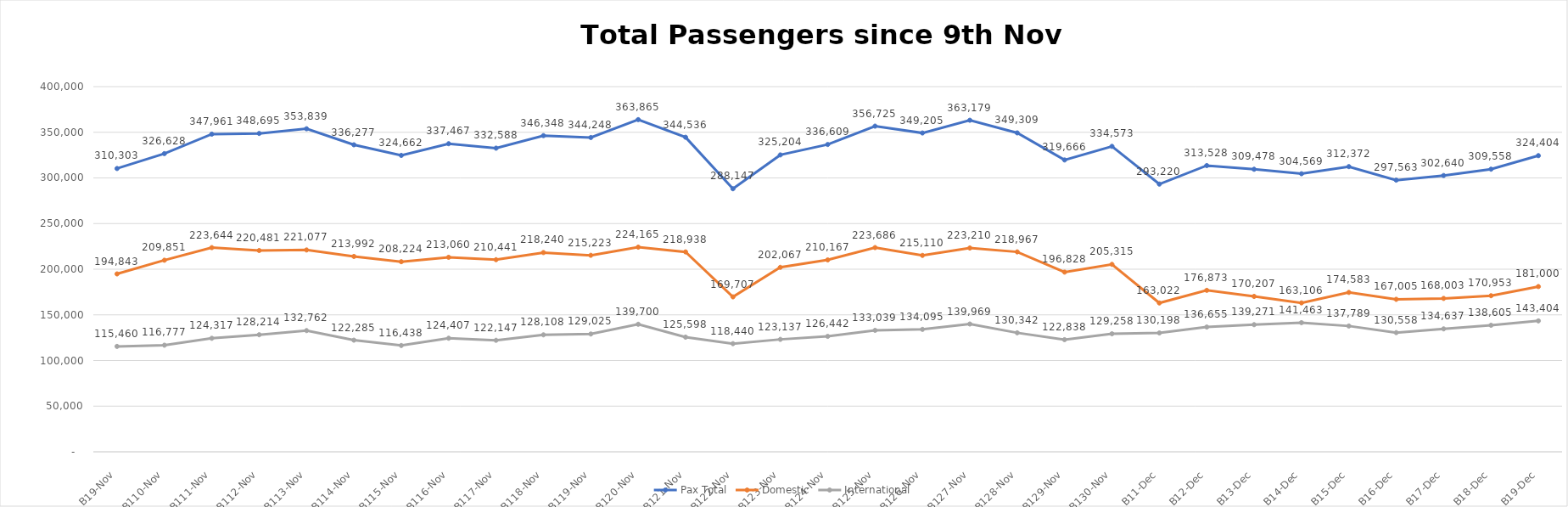
| Category | Pax Total |  Domestic  |  International  |
|---|---|---|---|
| 2022-11-09 | 310303 | 194843 | 115460 |
| 2022-11-10 | 326628 | 209851 | 116777 |
| 2022-11-11 | 347961 | 223644 | 124317 |
| 2022-11-12 | 348695 | 220481 | 128214 |
| 2022-11-13 | 353839 | 221077 | 132762 |
| 2022-11-14 | 336277 | 213992 | 122285 |
| 2022-11-15 | 324662 | 208224 | 116438 |
| 2022-11-16 | 337467 | 213060 | 124407 |
| 2022-11-17 | 332588 | 210441 | 122147 |
| 2022-11-18 | 346348 | 218240 | 128108 |
| 2022-11-19 | 344248 | 215223 | 129025 |
| 2022-11-20 | 363865 | 224165 | 139700 |
| 2022-11-21 | 344536 | 218938 | 125598 |
| 2022-11-22 | 288147 | 169707 | 118440 |
| 2022-11-23 | 325204 | 202067 | 123137 |
| 2022-11-24 | 336609 | 210167 | 126442 |
| 2022-11-25 | 356725 | 223686 | 133039 |
| 2022-11-26 | 349205 | 215110 | 134095 |
| 2022-11-27 | 363179 | 223210 | 139969 |
| 2022-11-28 | 349309 | 218967 | 130342 |
| 2022-11-29 | 319666 | 196828 | 122838 |
| 2022-11-30 | 334573 | 205315 | 129258 |
| 2022-12-01 | 293220 | 163022 | 130198 |
| 2022-12-02 | 313528 | 176873 | 136655 |
| 2022-12-03 | 309478 | 170207 | 139271 |
| 2022-12-04 | 304569 | 163106 | 141463 |
| 2022-12-05 | 312372 | 174583 | 137789 |
| 2022-12-06 | 297563 | 167005 | 130558 |
| 2022-12-07 | 302640 | 168003 | 134637 |
| 2022-12-08 | 309558 | 170953 | 138605 |
| 2022-12-09 | 324404 | 181000 | 143404 |